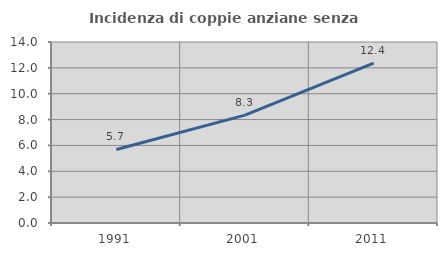
| Category | Incidenza di coppie anziane senza figli  |
|---|---|
| 1991.0 | 5.689 |
| 2001.0 | 8.345 |
| 2011.0 | 12.373 |